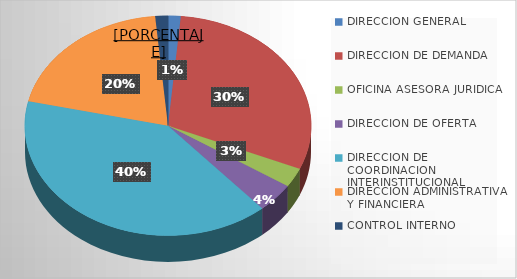
| Category | Series 0 |
|---|---|
| DIRECCION GENERAL | 1 |
| DIRECCION DE DEMANDA | 21 |
| OFICINA ASESORA JURIDICA | 2 |
| DIRECCION DE OFERTA | 3 |
| DIRECCION DE COORDINACION INTERINSTITUCIONAL | 28 |
| DIRECCION ADMINISTRATIVA Y FINANCIERA | 14 |
| CONTROL INTERNO | 1 |